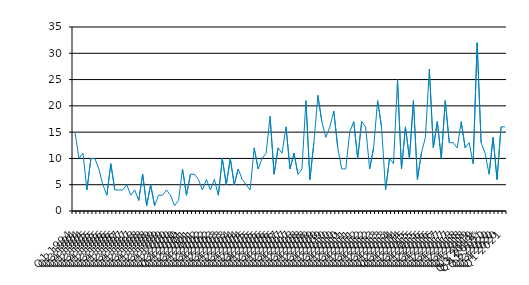
| Category | Series 0 |
|---|---|
| Q1 1994 | 15 |
| Q2 1994 | 10 |
| Q3 1994 | 11 |
| Q4 1994 | 4 |
| Q1 1995 | 10 |
| Q2 1995 | 10 |
| Q3 1995 | 8 |
| Q4 1995 | 5 |
| Q1 1996 | 3 |
| Q2 1996 | 9 |
| Q3 1996 | 4 |
| Q4 1996 | 4 |
| Q1 1997 | 4 |
| Q2 1997 | 5 |
| Q3 1997 | 3 |
| Q4 1997 | 4 |
| Q1 1998 | 2 |
| Q2 1998 | 7 |
| Q3 1998 | 1 |
| Q4 1998 | 5 |
| Q1 1999 | 1 |
| Q2 1999 | 3 |
| Q3 1999 | 3 |
| Q4 1999 | 4 |
| Q1 2000 | 3 |
| Q2 2000 | 1 |
| Q3 2000 | 2 |
| Q4 2000 | 8 |
| Q1 2001 | 3 |
| Q2 2001 | 7 |
| Q3 2001 | 7 |
| Q4 2001 | 6 |
| Q1 2002 | 4 |
| Q2 2002 | 6 |
| Q3 2002 | 4 |
| Q4 2002 | 6 |
| Q1 2003 | 3 |
| Q2 2003 | 10 |
| Q3 2003 | 5 |
| Q4 2003 | 10 |
| Q1 2004 | 5 |
| Q2 2004 | 8 |
| Q3 2004 | 6 |
| Q4 2004 | 5 |
| Q1 2005 | 4 |
| Q2 2005 | 12 |
| Q3 2005 | 8 |
| Q4 2005 | 10 |
| Q1 2006 | 11 |
| Q2 2006 | 18 |
| Q3 2006 | 7 |
| Q4 2006 | 12 |
| Q1 2007 | 11 |
| Q2 2007 | 16 |
| Q3 2007 | 8 |
| Q4 2007 | 11 |
| Q1 2008 | 7 |
| Q2 2008 | 8 |
| Q3 2008 | 21 |
| Q4 2008 | 6 |
| Q1 2009 | 13 |
| Q2 2009 | 22 |
| Q3 2009 | 17 |
| Q4 2009 | 14 |
| Q1 2010 | 16 |
| Q2 2010 | 19 |
| Q3 2010 | 12 |
| Q4 2010 | 8 |
| Q1 2011 | 8 |
| Q2 2011 | 15 |
| Q3 2011 | 17 |
| Q4 2011 | 10 |
| Q1 2012 | 17 |
| Q2 2012 | 16 |
| Q3 2012 | 8 |
| Q4 2012 | 12 |
| Q1 2013 | 21 |
| Q2 2013 | 16 |
| Q3 2013 | 4 |
| Q4 2013 | 10 |
| Q1 2014 | 9 |
| Q2 2014 | 25 |
| Q3 2014 | 8 |
| Q4 2014 | 16 |
| Q1 2015 | 10 |
| Q2 2015 | 21 |
| Q3 2015 | 6 |
| Q4 2015 | 11 |
| Q1 2016 | 14 |
| Q2 2016 | 27 |
| Q3 2016 | 12 |
| Q4 2016 | 17 |
| Q1 2017 | 10 |
| Q2 2017 | 21 |
| Q3 2017 | 13 |
| Q4 2017 | 13 |
| Q1 2018 | 12 |
| Q2 2018 | 17 |
| Q3 2018 | 12 |
| Q4 2018 | 13 |
| Q1 2019 | 9 |
| Q2 2019 | 32 |
| Q3 2019* | 13 |
| Q4 2019* | 11 |
| Q1 2020 | 7 |
| Q2 2020 | 14 |
| Q3 2020 | 6 |
| Q4 2020 | 16 |
| Q1 2021 | 16 |